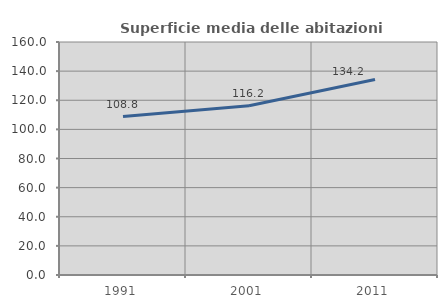
| Category | Superficie media delle abitazioni occupate |
|---|---|
| 1991.0 | 108.799 |
| 2001.0 | 116.248 |
| 2011.0 | 134.209 |